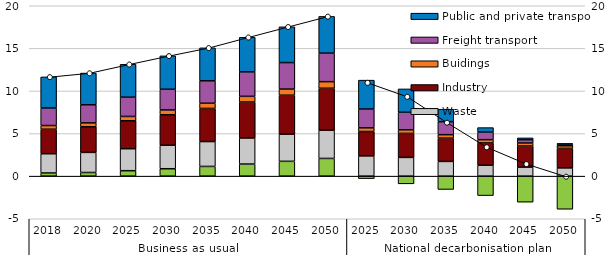
| Category | Agriculture, livestock, and forestry | Waste | Industry | Buidings | Freight transport | Public and private transport |
|---|---|---|---|---|---|---|
| 0 | 0.37 | 2.26 | 2.88 | 0.43 | 2.06 | 3.65 |
| 1 | 0.43 | 2.36 | 3.01 | 0.45 | 2.13 | 3.72 |
| 2 | 0.64 | 2.58 | 3.28 | 0.51 | 2.26 | 3.86 |
| 3 | 0.87 | 2.76 | 3.58 | 0.56 | 2.43 | 3.92 |
| 4 | 1.14 | 2.92 | 3.89 | 0.61 | 2.63 | 3.87 |
| 5 | 1.42 | 3.06 | 4.22 | 0.67 | 2.87 | 4.06 |
| 6 | 1.74 | 3.19 | 4.57 | 0.72 | 3.11 | 4.2 |
| 7 | 2.08 | 3.31 | 4.93 | 0.77 | 3.35 | 4.31 |
| 8 | -0.29 | 2.38 | 2.86 | 0.43 | 2.21 | 3.39 |
| 9 | -0.9 | 2.2 | 2.82 | 0.42 | 2.06 | 2.74 |
| 10 | -1.56 | 1.73 | 2.73 | 0.41 | 1.52 | 1.47 |
| 11 | -2.28 | 1.28 | 2.62 | 0.38 | 0.89 | 0.53 |
| 12 | -3.05 | 1.06 | 2.48 | 0.35 | 0.39 | 0.21 |
| 13 | -3.88 | 0.97 | 2.29 | 0.31 | 0.17 | 0.1 |